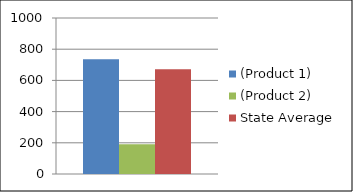
| Category | (Product 1) | (Product 2) | State Average |
|---|---|---|---|
| 0 | 736 | 191 | 672 |